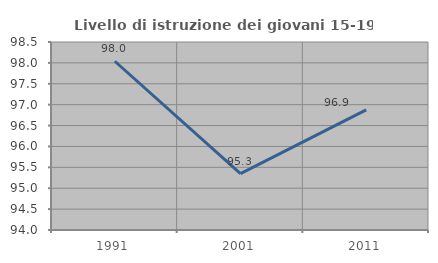
| Category | Livello di istruzione dei giovani 15-19 anni |
|---|---|
| 1991.0 | 98.039 |
| 2001.0 | 95.349 |
| 2011.0 | 96.875 |